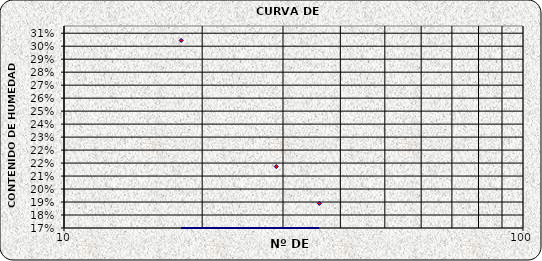
| Category | Series 0 |
|---|---|
| 36.0 | 0.187 |
| 29.0 | 0.213 |
| 18.0 | 0.3 |